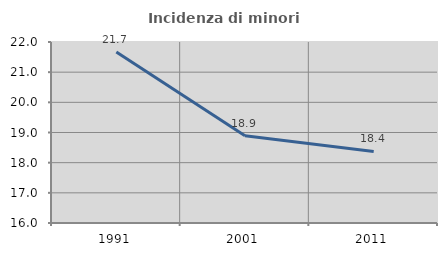
| Category | Incidenza di minori stranieri |
|---|---|
| 1991.0 | 21.667 |
| 2001.0 | 18.889 |
| 2011.0 | 18.373 |